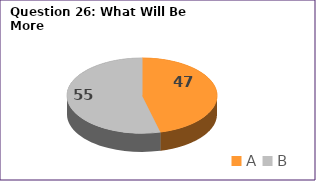
| Category | Series 0 |
|---|---|
| A | 47 |
| B | 55 |